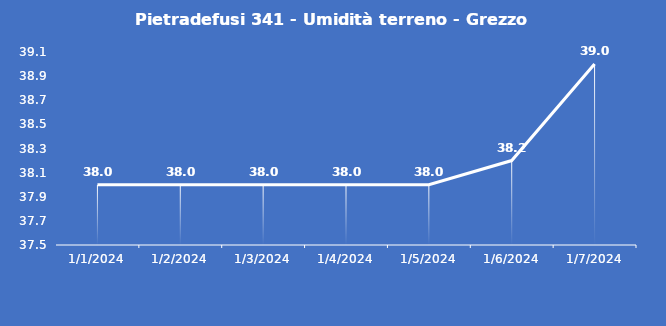
| Category | Pietradefusi 341 - Umidità terreno - Grezzo (%VWC) |
|---|---|
| 1/1/24 | 38 |
| 1/2/24 | 38 |
| 1/3/24 | 38 |
| 1/4/24 | 38 |
| 1/5/24 | 38 |
| 1/6/24 | 38.2 |
| 1/7/24 | 39 |